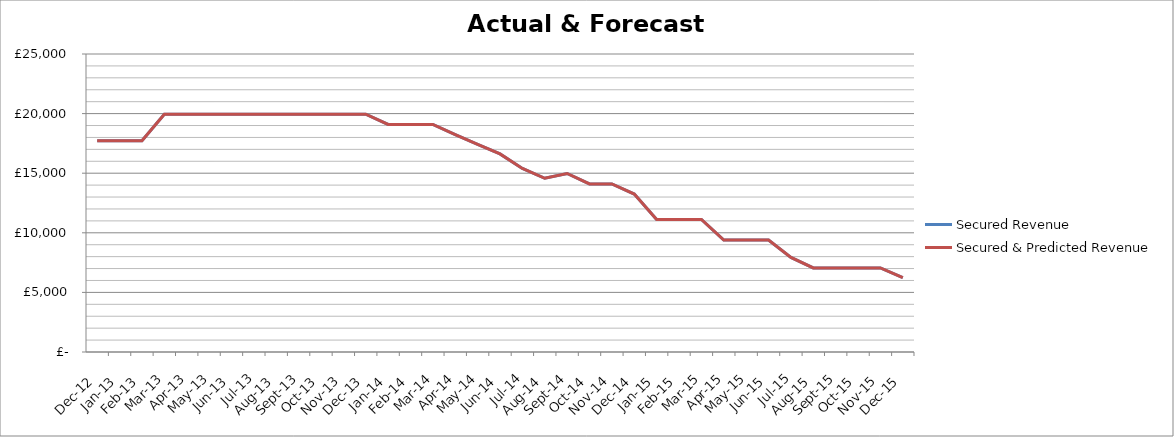
| Category | Secured Revenue | Secured & Predicted Revenue |
|---|---|---|
| 2012-12-01 | 17726.85 | 17726.85 |
| 2013-01-01 | 17726.85 | 17726.85 |
| 2013-02-01 | 17726.85 | 17726.85 |
| 2013-03-01 | 19946.25 | 19946.25 |
| 2013-04-01 | 19946.25 | 19946.25 |
| 2013-05-01 | 19946.25 | 19946.25 |
| 2013-06-01 | 19946.25 | 19946.25 |
| 2013-07-01 | 19946.25 | 19946.25 |
| 2013-08-01 | 19946.25 | 19946.25 |
| 2013-09-01 | 19946.25 | 19946.25 |
| 2013-10-01 | 19946.25 | 19946.25 |
| 2013-11-01 | 19946.25 | 19946.25 |
| 2013-12-01 | 19946.25 | 19946.25 |
| 2014-01-01 | 19091.7 | 19091.7 |
| 2014-02-01 | 19091.7 | 19091.7 |
| 2014-03-01 | 19091.7 | 19091.7 |
| 2014-04-01 | 18237.15 | 18237.15 |
| 2014-05-01 | 17427.15 | 17427.15 |
| 2014-06-01 | 16617.15 | 16617.15 |
| 2014-07-01 | 15402.15 | 15402.15 |
| 2014-08-01 | 14571.9 | 14571.9 |
| 2014-09-01 | 14976.9 | 14976.9 |
| 2014-10-01 | 14102.1 | 14102.1 |
| 2014-11-01 | 14102.1 | 14102.1 |
| 2014-12-01 | 13247.55 | 13247.55 |
| 2015-01-01 | 11121.3 | 11121.3 |
| 2015-02-01 | 11121.3 | 11121.3 |
| 2015-03-01 | 11121.3 | 11121.3 |
| 2015-04-01 | 9391.95 | 9391.95 |
| 2015-05-01 | 9391.95 | 9391.95 |
| 2015-06-01 | 9391.95 | 9391.95 |
| 2015-07-01 | 7929.9 | 7929.9 |
| 2015-08-01 | 7055.1 | 7055.1 |
| 2015-09-01 | 7055.1 | 7055.1 |
| 2015-10-01 | 7055.1 | 7055.1 |
| 2015-11-01 | 7055.1 | 7055.1 |
| 2015-12-01 | 6245.1 | 6245.1 |